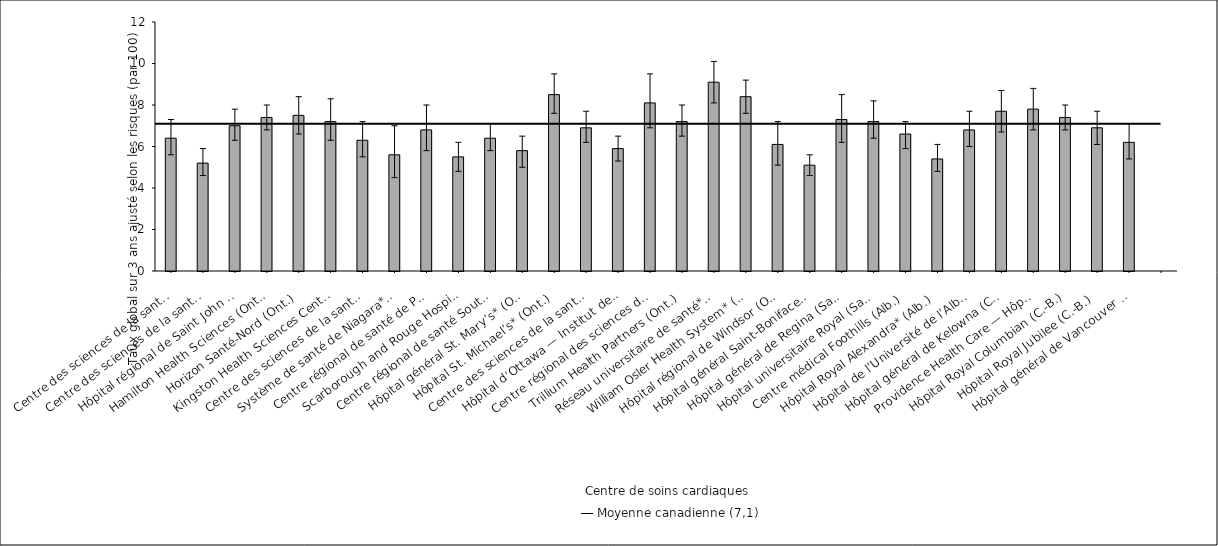
| Category | Taux ajusté selon les risques |
|---|---|
| Centre des sciences de la santé — St. John’s (T. -N.-L.) | 6.4 |
| Centre des sciences de la santé Queen Elizabeth II* (N.-É.) | 5.2 |
| Hôpital régional de Saint John (N.-B.) | 7 |
| Hamilton Health Sciences (Ont.) | 7.4 |
| Horizon Santé-Nord (Ont.) | 7.5 |
| Kingston Health Sciences Centre (Ont.) | 7.2 |
| Centre des sciences de la santé de London (Ont.) | 6.3 |
| Système de santé de Niagara* (Ont.) | 5.6 |
| Centre régional de santé de Peterborough (Ont.) | 6.8 |
| Scarborough and Rouge Hospital* (Ont.) | 5.5 |
| Centre régional de santé Southlake (Ont.) | 6.4 |
| Hôpital général St. Mary’s* (Ont.) | 5.8 |
| Hôpital St. Michael’s* (Ont.) | 8.5 |
| Centre des sciences de la santé Sunnybrook (Ont.) | 6.9 |
| Hôpital d’Ottawa — Institut de cardiologie de l’Université d’Ottawa* (Ont.) | 5.9 |
| Centre régional des sciences de la santé de Thunder Bay (Ont.) | 8.1 |
| Trillium Health Partners (Ont.) | 7.2 |
| Réseau universitaire de santé* (Ont.) | 9.1 |
| William Osler Health System* (Ont.) | 8.4 |
| Hôpital régional de Windsor (Ont.) | 6.1 |
| Hôpital général Saint-Boniface* (Man.) | 5.1 |
| Hôpital général de Regina (Sask.) | 7.3 |
| Hôpital universitaire Royal (Sask.) | 7.2 |
| Centre médical Foothills (Alb.) | 6.6 |
| Hôpital Royal Alexandra* (Alb.) | 5.4 |
| Hôpital de l’Université de l’Alberta (Alb.) | 6.8 |
| Hôpital général de Kelowna (C.-B.) | 7.7 |
| Providence Health Care — Hôpital St. Paul’s (Vancouver) (C.-B.) | 7.8 |
| Hôpital Royal Columbian (C.-B.) | 7.4 |
| Hôpital Royal Jubilee (C.-B.) | 6.9 |
| Hôpital général de Vancouver (C.-B.) | 6.2 |